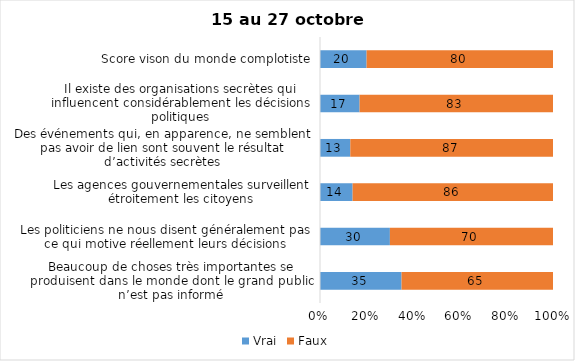
| Category | Vrai | Faux |
|---|---|---|
| Beaucoup de choses très importantes se produisent dans le monde dont le grand public n’est pas informé | 35 | 65 |
| Les politiciens ne nous disent généralement pas ce qui motive réellement leurs décisions | 30 | 70 |
| Les agences gouvernementales surveillent étroitement les citoyens | 14 | 86 |
| Des événements qui, en apparence, ne semblent pas avoir de lien sont souvent le résultat d’activités secrètes | 13 | 87 |
| Il existe des organisations secrètes qui influencent considérablement les décisions politiques | 17 | 83 |
| Score vison du monde complotiste | 20 | 80 |